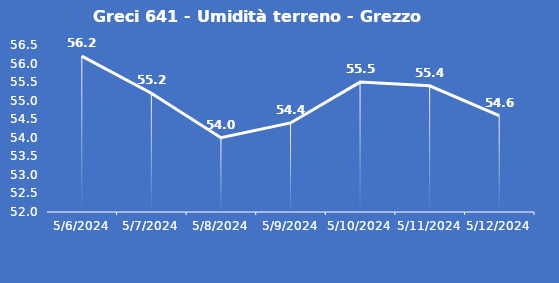
| Category | Greci 641 - Umidità terreno - Grezzo (%VWC) |
|---|---|
| 5/6/24 | 56.2 |
| 5/7/24 | 55.2 |
| 5/8/24 | 54 |
| 5/9/24 | 54.4 |
| 5/10/24 | 55.5 |
| 5/11/24 | 55.4 |
| 5/12/24 | 54.6 |